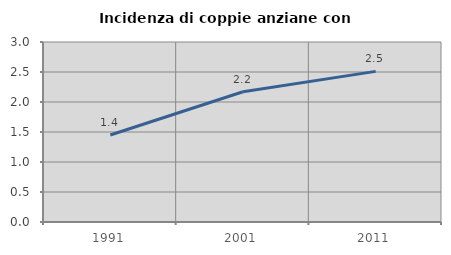
| Category | Incidenza di coppie anziane con figli |
|---|---|
| 1991.0 | 1.449 |
| 2001.0 | 2.171 |
| 2011.0 | 2.51 |